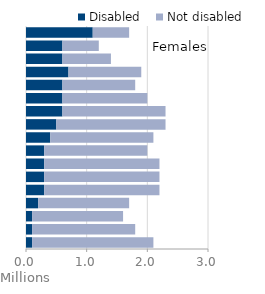
| Category | Disabled | Not disabled |
|---|---|---|
| 0-4 | 0.1 | 2 |
| 5-9 | 0.1 | 1.7 |
| 10-14 | 0.1 | 1.5 |
| 15-19 | 0.2 | 1.5 |
| 20-24 | 0.3 | 1.9 |
| 25-29 | 0.3 | 1.9 |
| 30-34 | 0.3 | 1.9 |
| 35-39 | 0.3 | 1.7 |
| 40-44 | 0.4 | 1.7 |
| 45-49 | 0.5 | 1.8 |
| 50-54 | 0.6 | 1.7 |
| 55-59 | 0.6 | 1.4 |
| 60-64 | 0.6 | 1.2 |
| 65-69 | 0.7 | 1.2 |
| 70-74 | 0.6 | 0.8 |
| 75-79 | 0.6 | 0.6 |
| 80+ | 1.1 | 0.6 |